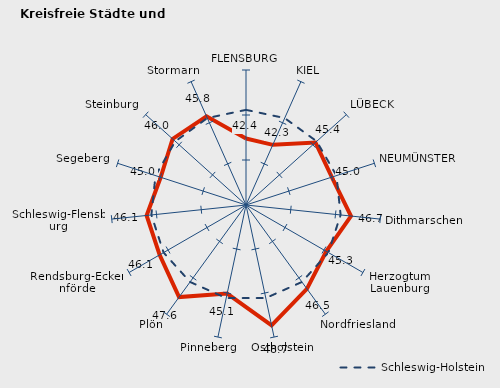
| Category | Kreise | Schleswig-Holstein |
|---|---|---|
| FLENSBURG | 42.389 | 45.571 |
| KIEL | 42.319 | 45.571 |
| LÜBECK | 45.379 | 45.571 |
| NEUMÜNSTER | 45.028 | 45.571 |
| Dithmarschen | 46.729 | 45.571 |
| Herzogtum Lauenburg | 45.299 | 45.571 |
| Nordfriesland | 46.511 | 45.571 |
| Ostholstein | 48.667 | 45.571 |
| Pinneberg | 45.059 | 45.571 |
| Plön | 47.649 | 45.571 |
| Rendsburg-Eckernförde | 46.085 | 45.571 |
| Schleswig-Flensburg | 46.105 | 45.571 |
| Segeberg | 44.969 | 45.571 |
| Steinburg | 45.976 | 45.571 |
| Stormarn | 45.784 | 45.571 |